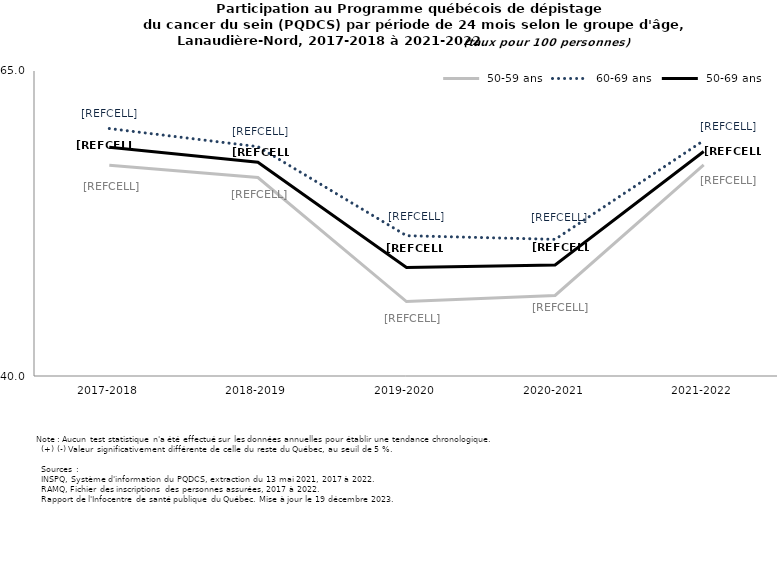
| Category |  50-59 ans |  60-69 ans |  50-69 ans |
|---|---|---|---|
| 2017-2018 | 57.273 | 60.283 | 58.75 |
| 2018-2019 | 56.269 | 58.8 | 57.528 |
| 2019-2020 | 46.1 | 51.5 | 48.9 |
| 2020-2021 | 46.6 | 51.2 | 49.1 |
| 2021-2022 | 57.3 | 59.3 | 58.4 |